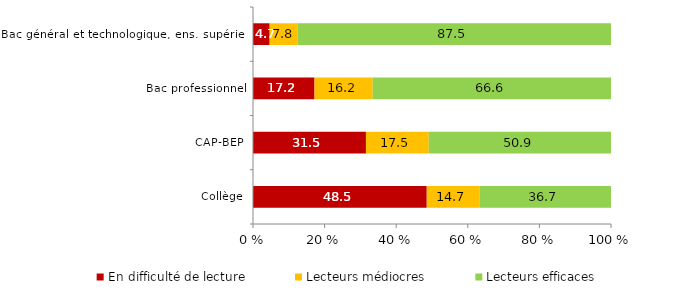
| Category | En difficulté de lecture | Lecteurs médiocres | Lecteurs efficaces |
|---|---|---|---|
| Collège | 48.534 | 14.729 | 36.737 |
| CAP-BEP | 31.545 | 17.547 | 50.907 |
| Bac professionnel | 17.189 | 16.247 | 66.564 |
| Bac général et technologique, ens. supérieur | 4.655 | 7.799 | 87.547 |